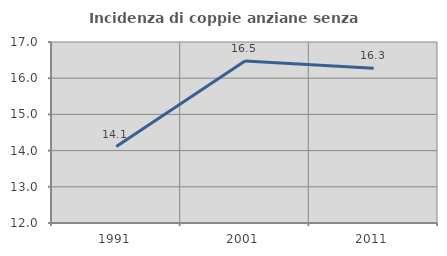
| Category | Incidenza di coppie anziane senza figli  |
|---|---|
| 1991.0 | 14.11 |
| 2001.0 | 16.474 |
| 2011.0 | 16.274 |